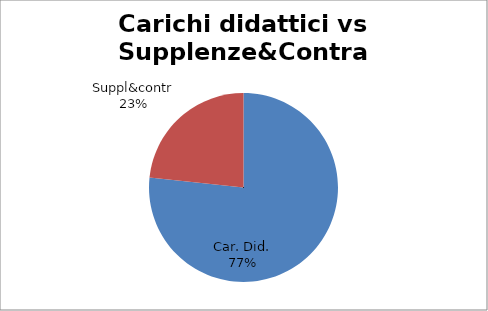
| Category | Series 0 |
|---|---|
| Car. Did. | 0.767 |
| Suppl&contr | 0.233 |